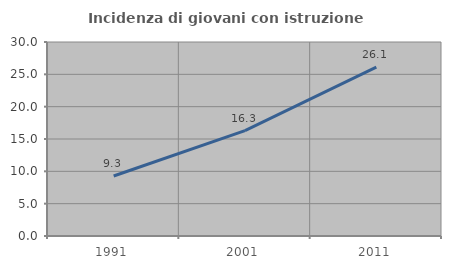
| Category | Incidenza di giovani con istruzione universitaria |
|---|---|
| 1991.0 | 9.279 |
| 2001.0 | 16.305 |
| 2011.0 | 26.101 |